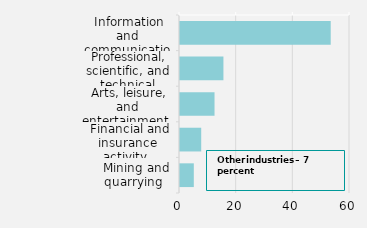
| Category | Percent |
|---|---|
| Information and communications | 53.197 |
| Professional, scientific, and technical activity | 15.326 |
| Arts, leisure, and entertainment | 12.185 |
| Financial and insurance activity | 7.487 |
| Mining and quarrying | 4.875 |